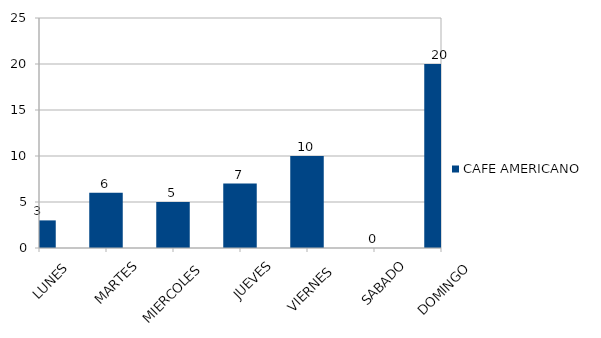
| Category | CAFE AMERICANO |
|---|---|
| LUNES | 3 |
| MARTES | 6 |
| MIERCOLES | 5 |
| JUEVES | 7 |
| VIERNES  | 10 |
| SABADO | 0 |
| DOMINGO | 20 |